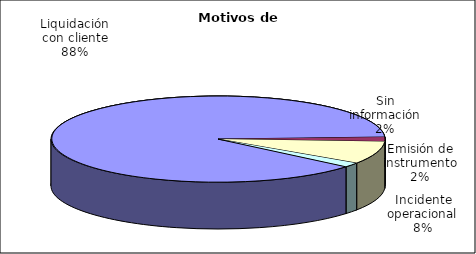
| Category | Motivos |
|---|---|
| Liquidación con cliente | 467 |
| Emisión de instrumento | 9 |
| Incidente operacional | 45 |
| Sin información | 9 |